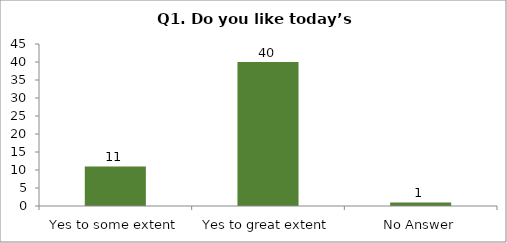
| Category | Q1. Do you like today’s session? |
|---|---|
| Yes to some extent | 11 |
| Yes to great extent | 40 |
| No Answer | 1 |